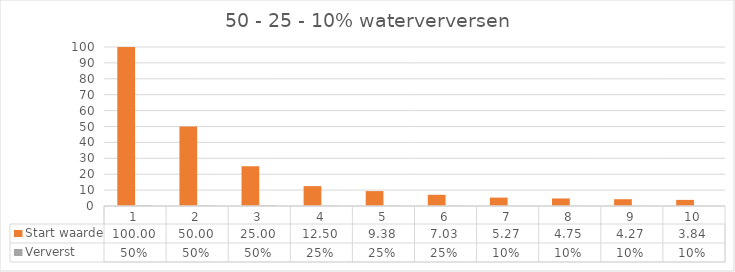
| Category | Start waarde | Ververst |
|---|---|---|
| 0 | 100 | 0.5 |
| 1 | 50 | 0.5 |
| 2 | 25 | 0.5 |
| 3 | 12.5 | 0.25 |
| 4 | 9.375 | 0.25 |
| 5 | 7.031 | 0.25 |
| 6 | 5.273 | 0.1 |
| 7 | 4.746 | 0.1 |
| 8 | 4.271 | 0.1 |
| 9 | 3.844 | 0.1 |